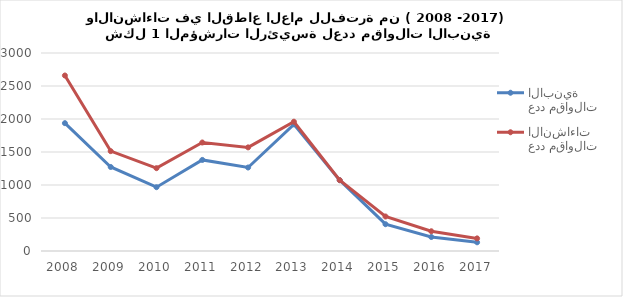
| Category | عدد مقاولات الابنية | عدد مقاولات الانشاءات |
|---|---|---|
| 2008.0 | 1937 | 2659 |
| 2009.0 | 1273 | 1513 |
| 2010.0 | 967 | 1255 |
| 2011.0 | 1380 | 1644 |
| 2012.0 | 1265 | 1570 |
| 2013.0 | 1919 | 1959 |
| 2014.0 | 1073 | 1073 |
| 2015.0 | 406 | 523 |
| 2016.0 | 212 | 299 |
| 2017.0 | 132 | 191 |